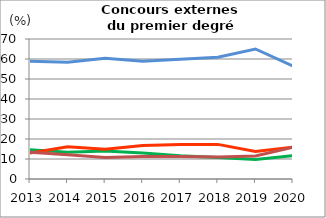
| Category | Étudiants | Enseignants et personnels d'éducation et de surveillance                            | Autres emplois dans secteurs public ou privé                | Sans emploi                    |
|---|---|---|---|---|
| 2013.0 | 58.879 | 14.658 | 12.998 | 13.4 |
| 2014.0 | 58.408 | 13.385 | 16.112 | 12.096 |
| 2015.0 | 60.4 | 14 | 14.9 | 10.7 |
| 2016.0 | 58.9 | 13 | 16.8 | 11.3 |
| 2017.0 | 59.9 | 11.6 | 17.2 | 11.3 |
| 2018.0 | 60.9 | 10.8 | 17.3 | 11 |
| 2019.0 | 65 | 9.7 | 13.8 | 11.5 |
| 2020.0 | 56.5 | 11.7 | 15.9 | 15.9 |